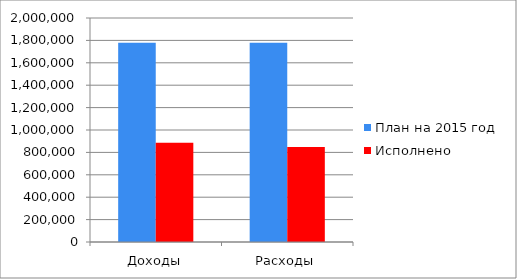
| Category | План на 2015 год | Исполнено  |
|---|---|---|
| Доходы | 1778112 | 886174 |
| Расходы | 1779614 | 849016 |